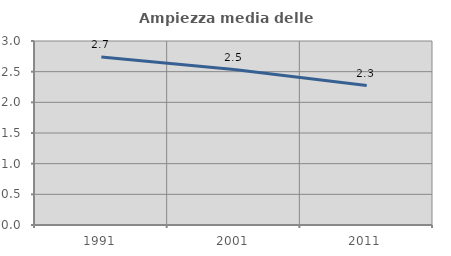
| Category | Ampiezza media delle famiglie |
|---|---|
| 1991.0 | 2.74 |
| 2001.0 | 2.535 |
| 2011.0 | 2.273 |